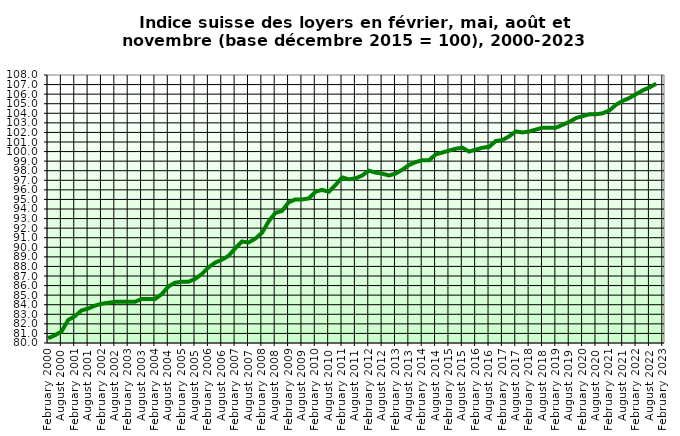
| Category | 4 : base décembre 2015=100 |
|---|---|
| 2000-02-01 | 80.5 |
| 2000-05-01 | 80.8 |
| 2000-08-01 | 81.2 |
| 2000-11-01 | 82.4 |
| 2001-02-01 | 82.8 |
| 2001-05-01 | 83.4 |
| 2001-08-01 | 83.6 |
| 2001-11-01 | 83.9 |
| 2002-02-01 | 84.1 |
| 2002-05-01 | 84.2 |
| 2002-08-01 | 84.3 |
| 2002-11-01 | 84.3 |
| 2003-02-01 | 84.3 |
| 2003-05-01 | 84.3 |
| 2003-08-01 | 84.6 |
| 2003-11-01 | 84.6 |
| 2004-02-01 | 84.6 |
| 2004-05-01 | 85.1 |
| 2004-08-01 | 85.9 |
| 2004-11-01 | 86.3 |
| 2005-02-01 | 86.4 |
| 2005-05-01 | 86.4 |
| 2005-08-01 | 86.7 |
| 2005-11-01 | 87.2 |
| 2006-02-01 | 87.9 |
| 2006-05-01 | 88.4 |
| 2006-08-01 | 88.7 |
| 2006-11-01 | 89.1 |
| 2007-02-01 | 89.9 |
| 2007-05-01 | 90.6 |
| 2007-08-01 | 90.5 |
| 2007-11-01 | 90.9 |
| 2008-02-01 | 91.5 |
| 2008-05-01 | 92.7 |
| 2008-08-01 | 93.6 |
| 2008-11-01 | 93.8 |
| 2009-02-01 | 94.7 |
| 2009-05-01 | 95 |
| 2009-08-01 | 95 |
| 2009-11-01 | 95.1 |
| 2010-02-01 | 95.8 |
| 2010-05-01 | 96 |
| 2010-08-01 | 95.8 |
| 2010-11-01 | 96.5 |
| 2011-02-01 | 97.3 |
| 2011-05-01 | 97.1 |
| 2011-08-01 | 97.2 |
| 2011-11-01 | 97.5 |
| 2012-02-01 | 98 |
| 2012-05-01 | 97.8 |
| 2012-08-01 | 97.7 |
| 2012-11-01 | 97.5 |
| 2013-02-01 | 97.7 |
| 2013-05-01 | 98.1 |
| 2013-08-01 | 98.6 |
| 2013-11-01 | 98.9 |
| 2014-02-01 | 99.1 |
| 2014-05-01 | 99.1 |
| 2014-08-01 | 99.7 |
| 2014-11-01 | 99.9 |
| 2015-02-01 | 100.1 |
| 2015-05-01 | 100.3 |
| 2015-08-01 | 100.4 |
| 2015-11-01 | 100 |
| 2016-02-01 | 100.2 |
| 2016-05-01 | 100.4 |
| 2016-08-01 | 100.5 |
| 2016-11-01 | 101.1 |
| 2017-02-01 | 101.2 |
| 2017-05-01 | 101.6 |
| 2017-08-01 | 102.1 |
| 2017-11-01 | 102 |
| 2018-02-01 | 102.1 |
| 2018-05-01 | 102.3 |
| 2018-08-01 | 102.5 |
| 2018-11-01 | 102.5 |
| 2019-02-01 | 102.5 |
| 2019-05-01 | 102.8 |
| 2019-08-01 | 103.1 |
| 2019-11-01 | 103.5 |
| 2020-02-01 | 103.7 |
| 2020-05-01 | 103.9 |
| 2020-08-01 | 103.9 |
| 2020-11-01 | 104 |
| 2021-02-01 | 104.3 |
| 2021-05-01 | 104.9 |
| 2021-08-01 | 105.3 |
| 2021-11-01 | 105.6 |
| 2022-02-01 | 106 |
| 2022-05-01 | 106.4 |
| 2022-08-01 | 106.7 |
| 2022-11-01 | 107.1 |